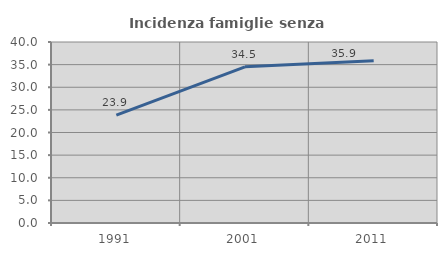
| Category | Incidenza famiglie senza nuclei |
|---|---|
| 1991.0 | 23.86 |
| 2001.0 | 34.513 |
| 2011.0 | 35.878 |